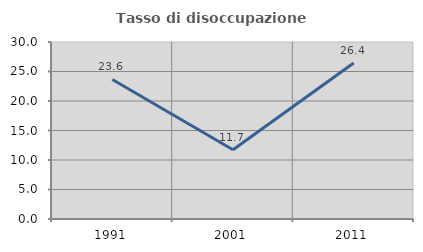
| Category | Tasso di disoccupazione giovanile  |
|---|---|
| 1991.0 | 23.649 |
| 2001.0 | 11.735 |
| 2011.0 | 26.437 |